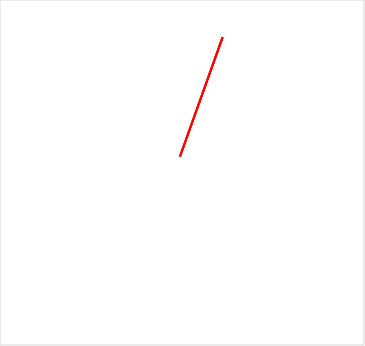
| Category | Series 0 |
|---|---|
| 0.0 | 0 |
| 0.3090169943749472 | 0.951 |
| 0.0 | 0 |